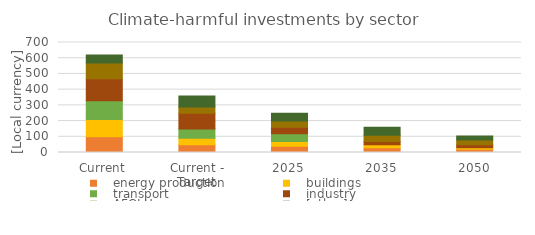
| Category |    energy production |    buildings |    transport |    industry |    AFOLU |    [other] |
|---|---|---|---|---|---|---|
| Current | 100 | 110 | 120 | 140 | 100 | 50 |
| Current - Target | 50 | 40 | 60 | 100 | 40 | 70 |
| 2025 | 40 | 30 | 50 | 40 | 40 | 50 |
| 2035 | 30 | 20 | 0 | 20 | 40 | 50 |
| 2050 | 20 | 10 | 0 | 20 | 30 | 25 |